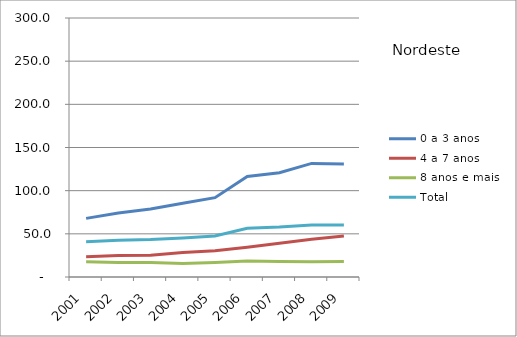
| Category | 0 a 3 anos | 4 a 7 anos | 8 anos e mais | Total |
|---|---|---|---|---|
| 2001.0 | 67.9 | 23.4 | 17.8 | 40.9 |
| 2002.0 | 74.1 | 25 | 16.8 | 42.6 |
| 2003.0 | 78.7 | 25.2 | 16.8 | 43.3 |
| 2004.0 | 85.5 | 28.3 | 15.5 | 45.2 |
| 2005.0 | 91.9 | 30.4 | 16.7 | 47.6 |
| 2006.0 | 116.5 | 34.4 | 18.4 | 56.5 |
| 2007.0 | 120.7 | 39.2 | 17.9 | 57.8 |
| 2008.0 | 131.6 | 43.6 | 17.8 | 60.3 |
| 2009.0 | 131 | 47.5 | 17.9 | 60.1 |